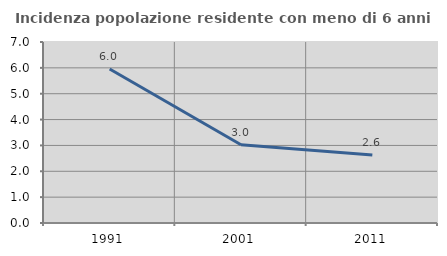
| Category | Incidenza popolazione residente con meno di 6 anni |
|---|---|
| 1991.0 | 5.957 |
| 2001.0 | 3.024 |
| 2011.0 | 2.625 |